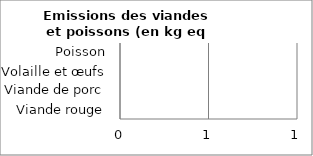
| Category | Series 0 |
|---|---|
| Viande rouge | 0 |
| Viande de porc | 0 |
| Volaille et œufs | 0 |
| Poisson | 0 |